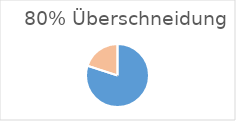
| Category | Series 0 |
|---|---|
| 0 | 80 |
| 1 | 20 |